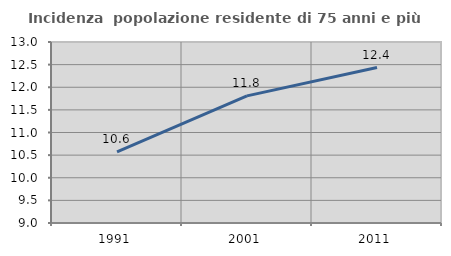
| Category | Incidenza  popolazione residente di 75 anni e più |
|---|---|
| 1991.0 | 10.574 |
| 2001.0 | 11.81 |
| 2011.0 | 12.436 |